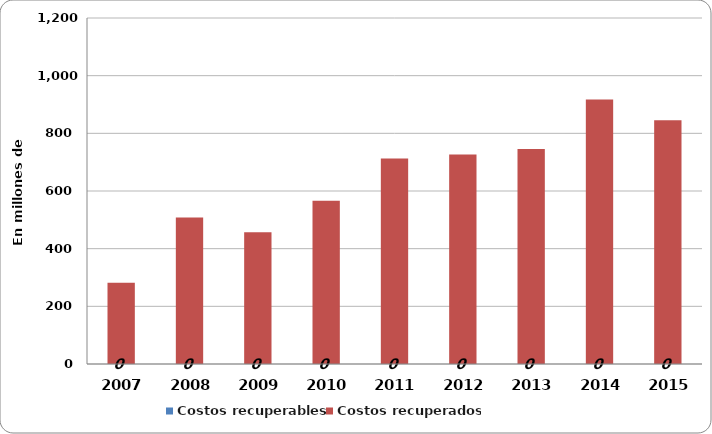
| Category | Costos recuperables | Costos recuperados |
|---|---|---|
| 2007.0 | 0 | 282 |
| 2008.0 | 0 | 508.5 |
| 2009.0 | 0 | 456.7 |
| 2010.0 | 0 | 566.3 |
| 2011.0 | 0 | 712.6 |
| 2012.0 | 0 | 726.5 |
| 2013.0 | 0 | 745.7 |
| 2014.0 | 0 | 917.5 |
| 2015.0 | 0 | 845.4 |